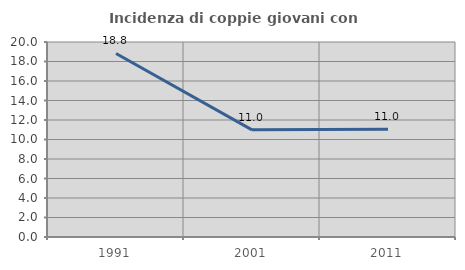
| Category | Incidenza di coppie giovani con figli |
|---|---|
| 1991.0 | 18.824 |
| 2001.0 | 10.987 |
| 2011.0 | 11.04 |